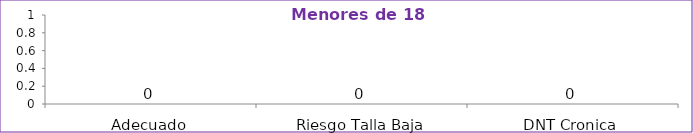
| Category | Series 0 |
|---|---|
| Adecuado | 0 |
| Riesgo Talla Baja | 0 |
| DNT Cronica | 0 |